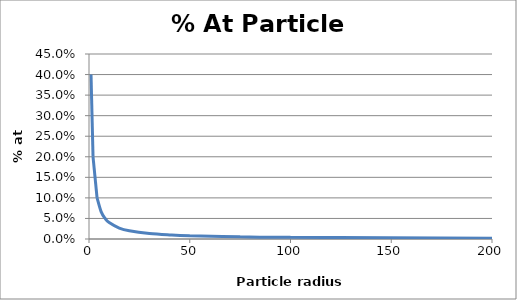
| Category | Series 0 |
|---|---|
| 1.0 | 0.4 |
| 2.0 | 0.2 |
| 4.0 | 0.1 |
| 6.0 | 0.067 |
| 8.0 | 0.05 |
| 10.0 | 0.04 |
| 15.0 | 0.027 |
| 20.0 | 0.02 |
| 30.0 | 0.013 |
| 40.0 | 0.01 |
| 50.0 | 0.008 |
| 75.0 | 0.005 |
| 100.0 | 0.004 |
| 200.0 | 0.002 |